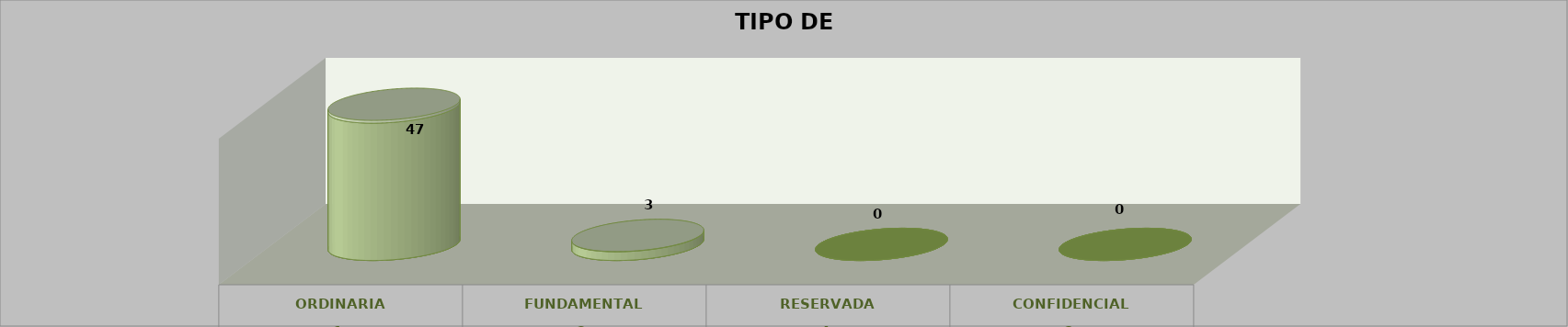
| Category | Series 0 | Series 2 | Series 1 | Series 3 | Series 4 |
|---|---|---|---|---|---|
| 0 |  |  |  | 47 | 0.94 |
| 1 |  |  |  | 3 | 0.06 |
| 2 |  |  |  | 0 | 0 |
| 3 |  |  |  | 0 | 0 |